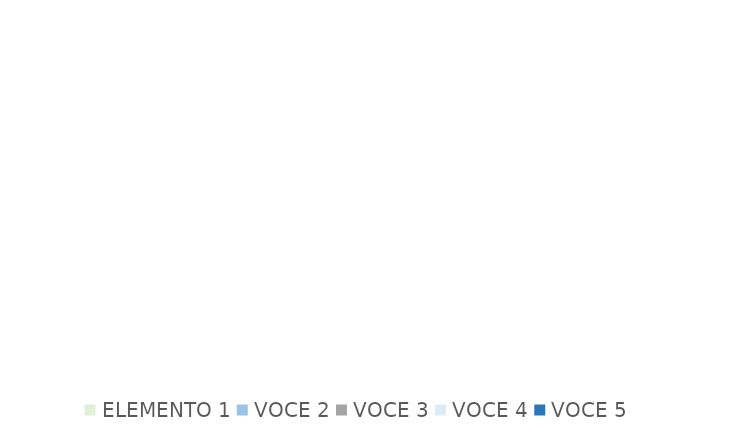
| Category | Series 0 |
|---|---|
| ELEMENTO 1 | 0 |
| VOCE 2 | 0 |
| VOCE 3 | 0 |
| VOCE 4 | 0 |
| VOCE 5 | 0 |